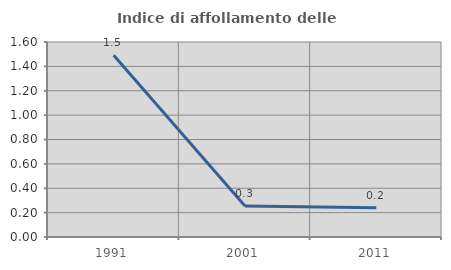
| Category | Indice di affollamento delle abitazioni  |
|---|---|
| 1991.0 | 1.491 |
| 2001.0 | 0.254 |
| 2011.0 | 0.24 |